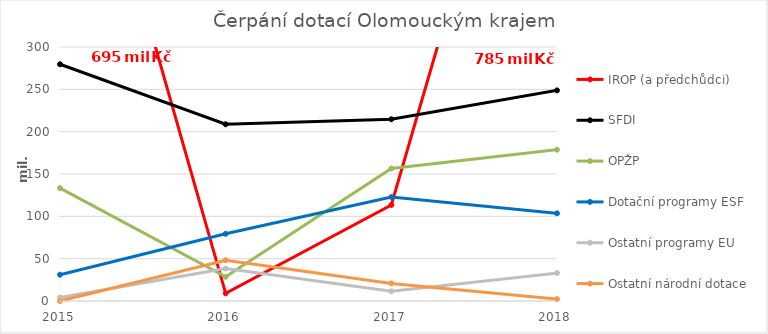
| Category | IROP (a předchůdci) | SFDI | OPŽP | Dotační programy ESF | Ostatní programy EU | Ostatní národní dotace |
|---|---|---|---|---|---|---|
| 2015.0 | 695398 | 279607 | 133386 | 31033 | 4167 | 0 |
| 2016.0 | 9082 | 208723 | 28500 | 79376 | 38354 | 48133 |
| 2017.0 | 113444 | 214675 | 156501 | 122794 | 11423 | 20765 |
| 2018.0 | 784816 | 248777 | 178723 | 103550 | 32996 | 2187 |